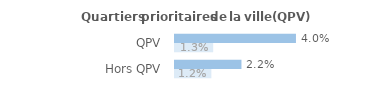
| Category | Series 0 | Series 1 |
|---|---|---|
| QPV | 0.04 | 0.013 |
| Hors QPV | 0.022 | 0.012 |